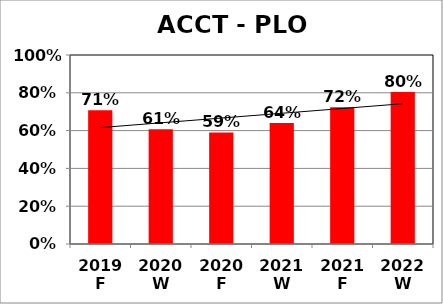
| Category | Series 0 |
|---|---|
| 2019 F | 0.708 |
| 2020 W | 0.607 |
| 2020 F | 0.59 |
| 2021 W | 0.64 |
| 2021 F | 0.724 |
| 2022 W | 0.805 |